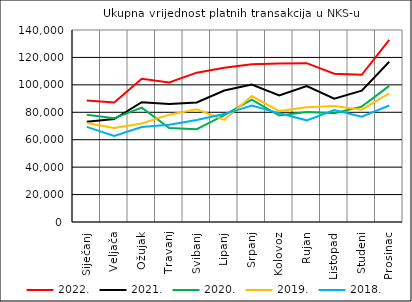
| Category | 2022. | 2021. | 2020. | 2019. | 2018. |
|---|---|---|---|---|---|
| Siječanj | 88568.211 | 73015.721 | 78223.611 | 72184.265 | 69351.764 |
| Veljača | 87217.567 | 75068.685 | 75658.633 | 68627.262 | 62759.148 |
| Ožujak | 104391.478 | 87328.5 | 83413.752 | 71840.558 | 69289.864 |
| Travanj | 101771.884 | 85958.633 | 68495.201 | 78264.843 | 70991.528 |
| Svibanj | 108894.499 | 87110.547 | 67690.304 | 82243.195 | 74413.682 |
| Lipanj | 112466.31 | 95904.61 | 77955.009 | 74431.908 | 78689.421 |
| Srpanj | 115031.606 | 100270.862 | 89295.612 | 91846.357 | 85004.852 |
| Kolovoz | 115604.065 | 92233.302 | 77630.264 | 80865.567 | 79264.001 |
| Rujan | 115819.51 | 99122.364 | 80127.998 | 83666.014 | 74134.007 |
| Listopad | 108181.797 | 89941.214 | 79344.72 | 84569.96 | 81591.941 |
| Studeni | 107340.074 | 95746.994 | 84122.458 | 81864.065 | 76800.959 |
| Prosinac | 132812.938 | 116809.723 | 99261.22 | 93867.932 | 84938.1 |